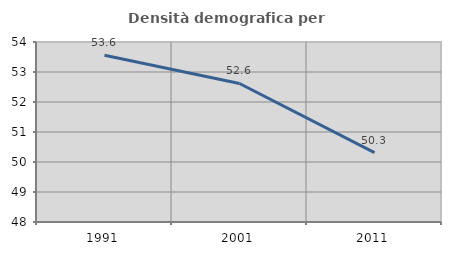
| Category | Densità demografica |
|---|---|
| 1991.0 | 53.558 |
| 2001.0 | 52.617 |
| 2011.0 | 50.311 |